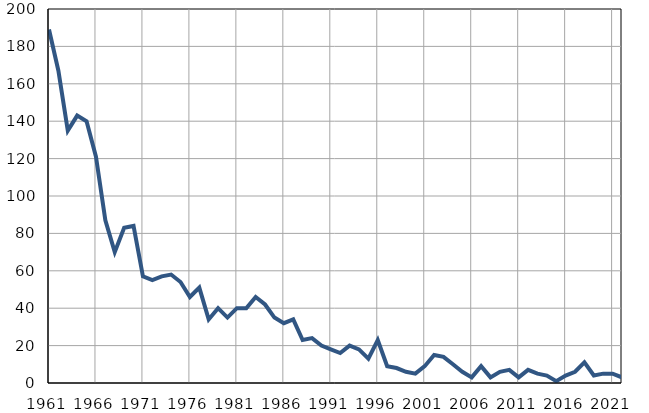
| Category | Умрла 
одојчад |
|---|---|
| 1961.0 | 189 |
| 1962.0 | 167 |
| 1963.0 | 135 |
| 1964.0 | 143 |
| 1965.0 | 140 |
| 1966.0 | 121 |
| 1967.0 | 87 |
| 1968.0 | 70 |
| 1969.0 | 83 |
| 1970.0 | 84 |
| 1971.0 | 57 |
| 1972.0 | 55 |
| 1973.0 | 57 |
| 1974.0 | 58 |
| 1975.0 | 54 |
| 1976.0 | 46 |
| 1977.0 | 51 |
| 1978.0 | 34 |
| 1979.0 | 40 |
| 1980.0 | 35 |
| 1981.0 | 40 |
| 1982.0 | 40 |
| 1983.0 | 46 |
| 1984.0 | 42 |
| 1985.0 | 35 |
| 1986.0 | 32 |
| 1987.0 | 34 |
| 1988.0 | 23 |
| 1989.0 | 24 |
| 1990.0 | 20 |
| 1991.0 | 18 |
| 1992.0 | 16 |
| 1993.0 | 20 |
| 1994.0 | 18 |
| 1995.0 | 13 |
| 1996.0 | 23 |
| 1997.0 | 9 |
| 1998.0 | 8 |
| 1999.0 | 6 |
| 2000.0 | 5 |
| 2001.0 | 9 |
| 2002.0 | 15 |
| 2003.0 | 14 |
| 2004.0 | 10 |
| 2005.0 | 6 |
| 2006.0 | 3 |
| 2007.0 | 9 |
| 2008.0 | 3 |
| 2009.0 | 6 |
| 2010.0 | 7 |
| 2011.0 | 3 |
| 2012.0 | 7 |
| 2013.0 | 5 |
| 2014.0 | 4 |
| 2015.0 | 1 |
| 2016.0 | 4 |
| 2017.0 | 6 |
| 2018.0 | 11 |
| 2019.0 | 4 |
| 2020.0 | 5 |
| 2021.0 | 5 |
| 2022.0 | 3 |